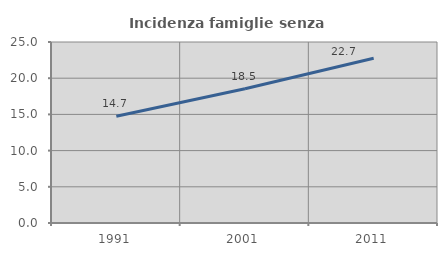
| Category | Incidenza famiglie senza nuclei |
|---|---|
| 1991.0 | 14.734 |
| 2001.0 | 18.544 |
| 2011.0 | 22.748 |